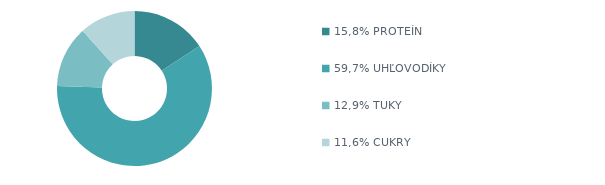
| Category | Series 0 |
|---|---|
| 15,8% PROTEÍN | 915 |
| 59,7% UHĽOVODÍKY | 3460 |
| 12,9% TUKY | 745 |
| 11,6% CUKRY | 675 |